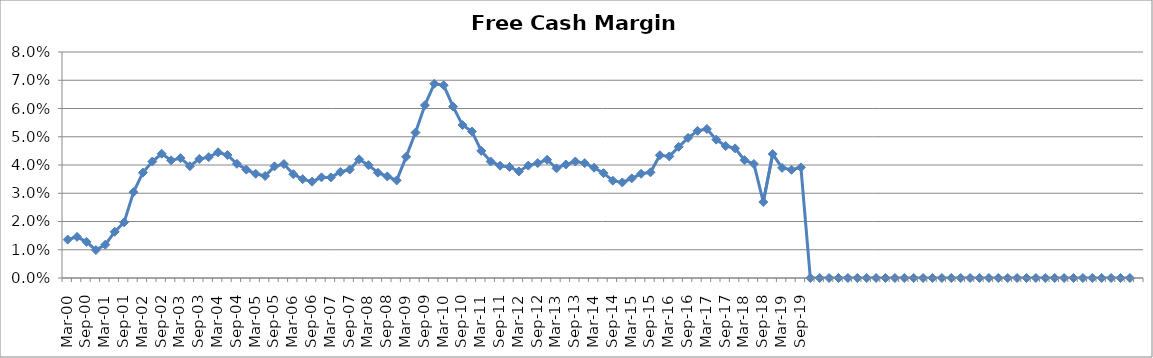
| Category | Revenue ($Millions) |
|---|---|
| Mar-00 | 0.014 |
| Jun-00 | 0.015 |
| Sep-00 | 0.013 |
| Dec-00 | 0.01 |
| Mar-01 | 0.012 |
| Jun-01 | 0.016 |
| Sep-01 | 0.02 |
| Dec-01 | 0.03 |
| Mar-02 | 0.037 |
| Jun-02 | 0.041 |
| Sep-02 | 0.044 |
| Dec-02 | 0.042 |
| Mar-03 | 0.042 |
| Jun-03 | 0.04 |
| Sep-03 | 0.042 |
| Dec-03 | 0.043 |
| Mar-04 | 0.044 |
| Jun-04 | 0.044 |
| Sep-04 | 0.04 |
| Dec-04 | 0.038 |
| Mar-05 | 0.037 |
| Jun-05 | 0.036 |
| Sep-05 | 0.04 |
| Dec-05 | 0.04 |
| Mar-06 | 0.037 |
| Jun-06 | 0.035 |
| Sep-06 | 0.034 |
| Dec-06 | 0.036 |
| Mar-07 | 0.036 |
| Jun-07 | 0.038 |
| Sep-07 | 0.038 |
| Dec-07 | 0.042 |
| Mar-08 | 0.04 |
| Jun-08 | 0.037 |
| Sep-08 | 0.036 |
| Dec-08 | 0.035 |
| Mar-09 | 0.043 |
| Jun-09 | 0.051 |
| Sep-09 | 0.061 |
| Dec-09 | 0.069 |
| Mar-10 | 0.068 |
| Jun-10 | 0.061 |
| Sep-10 | 0.054 |
| Dec-10 | 0.052 |
| Mar-11 | 0.045 |
| Jun-11 | 0.041 |
| Sep-11 | 0.04 |
| Dec-11 | 0.039 |
| Mar-12 | 0.038 |
| Jun-12 | 0.04 |
| Sep-12 | 0.041 |
| Dec-12 | 0.042 |
| Mar-13 | 0.039 |
| Jun-13 | 0.04 |
| Sep-13 | 0.041 |
| Dec-13 | 0.041 |
| Mar-14 | 0.039 |
| Jun-14 | 0.037 |
| Sep-14 | 0.034 |
| Dec-14 | 0.034 |
| Mar-15 | 0.035 |
| Jun-15 | 0.037 |
| Sep-15 | 0.037 |
| Dec-15 | 0.043 |
| Mar-16 | 0.043 |
| Jun-16 | 0.046 |
| Sep-16 | 0.05 |
| Dec-16 | 0.052 |
| Mar-17 | 0.053 |
| Jun-17 | 0.049 |
| Sep-17 | 0.047 |
| Dec-17 | 0.046 |
| Mar-18 | 0.042 |
| Jun-18 | 0.04 |
| Sep-18 | 0.027 |
| Dec-18 | 0.044 |
| Mar-19 | 0.039 |
| Jun-19 | 0.038 |
| Sep-19 | 0.039 |